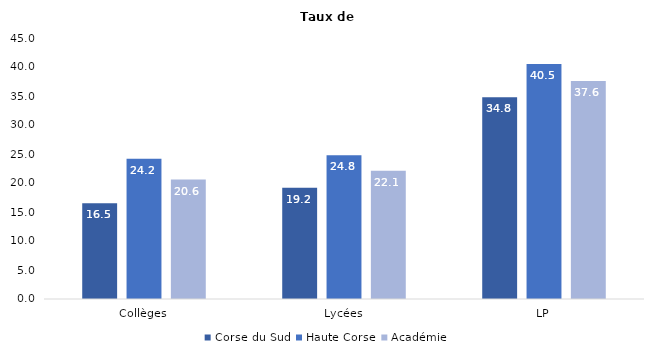
| Category | Corse du Sud | Haute Corse | Académie |
|---|---|---|---|
| Collèges | 16.5 | 24.2 | 20.6 |
| Lycées | 19.2 | 24.8 | 22.1 |
| LP | 34.8 | 40.5 | 37.6 |